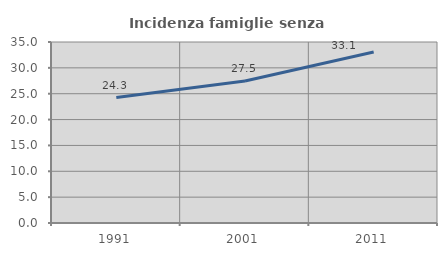
| Category | Incidenza famiglie senza nuclei |
|---|---|
| 1991.0 | 24.262 |
| 2001.0 | 27.471 |
| 2011.0 | 33.065 |